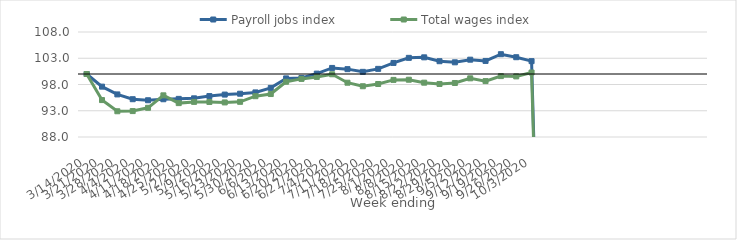
| Category | Payroll jobs index | Total wages index |
|---|---|---|
| 14/03/2020 | 100 | 100 |
| 21/03/2020 | 97.593 | 95.036 |
| 28/03/2020 | 96.11 | 92.903 |
| 04/04/2020 | 95.198 | 92.936 |
| 11/04/2020 | 95 | 93.562 |
| 18/04/2020 | 95.191 | 95.935 |
| 25/04/2020 | 95.264 | 94.455 |
| 02/05/2020 | 95.365 | 94.689 |
| 09/05/2020 | 95.796 | 94.673 |
| 16/05/2020 | 96.08 | 94.584 |
| 23/05/2020 | 96.243 | 94.702 |
| 30/05/2020 | 96.492 | 95.772 |
| 06/06/2020 | 97.355 | 96.183 |
| 13/06/2020 | 99.161 | 98.526 |
| 20/06/2020 | 99.244 | 99.067 |
| 27/06/2020 | 100.073 | 99.443 |
| 04/07/2020 | 101.158 | 99.948 |
| 11/07/2020 | 100.926 | 98.342 |
| 18/07/2020 | 100.41 | 97.669 |
| 25/07/2020 | 100.977 | 98.094 |
| 01/08/2020 | 102.106 | 98.878 |
| 08/08/2020 | 103.077 | 98.91 |
| 15/08/2020 | 103.173 | 98.346 |
| 22/08/2020 | 102.435 | 98.101 |
| 29/08/2020 | 102.225 | 98.286 |
| 05/09/2020 | 102.726 | 99.173 |
| 12/09/2020 | 102.489 | 98.646 |
| 19/09/2020 | 103.772 | 99.601 |
| 26/09/2020 | 103.198 | 99.544 |
| 03/10/2020 | 102.447 | 100.28 |